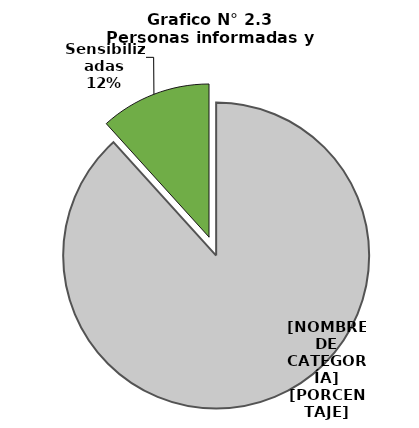
| Category | Series 0 |
|---|---|
| Informadas | 1295278 |
| Sensibilizadas | 171935 |